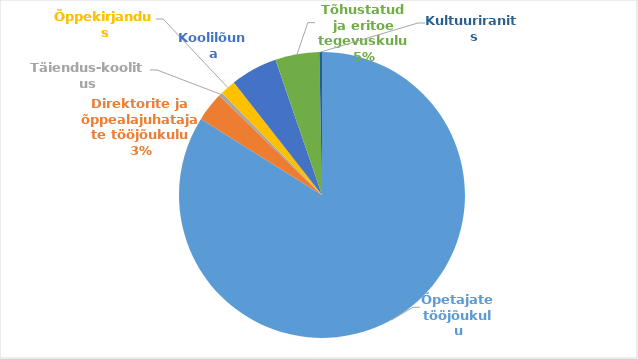
| Category | Series 0 |
|---|---|
| Õpetajate tööjõukulu | 393043079 |
| Direktorite ja õppealajuhatajate tööjõukulu | 15454980 |
| Täiendus-koolitus | 1994448 |
| Õppekirjandus | 8316470 |
| Koolilõuna | 24797500 |
| Tõhustatud ja eritoe tegevuskulu | 23315689 |
| Kultuuriranits | 1379904 |